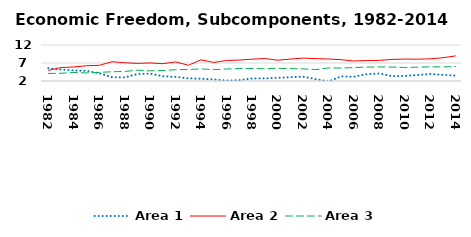
| Category | Area 1 | Area 2 | Area 3 |
|---|---|---|---|
| 1982.0 | 5.53 | 4.941 | 4.092 |
| 1983.0 | 5.189 | 5.735 | 4.14 |
| 1984.0 | 4.924 | 5.889 | 4.375 |
| 1985.0 | 4.811 | 6.241 | 4.236 |
| 1986.0 | 4.141 | 6.353 | 4.383 |
| 1987.0 | 3.063 | 7.36 | 4.567 |
| 1988.0 | 2.995 | 7.066 | 4.651 |
| 1989.0 | 3.935 | 6.888 | 5.02 |
| 1990.0 | 4.038 | 7.011 | 4.812 |
| 1991.0 | 3.326 | 6.808 | 4.91 |
| 1992.0 | 3.127 | 7.301 | 5.132 |
| 1993.0 | 2.737 | 6.378 | 5.208 |
| 1994.0 | 2.633 | 7.883 | 5.348 |
| 1995.0 | 2.434 | 7.153 | 5.16 |
| 1996.0 | 2.128 | 7.692 | 5.332 |
| 1997.0 | 2.235 | 7.812 | 5.48 |
| 1998.0 | 2.713 | 8.061 | 5.484 |
| 1999.0 | 2.718 | 8.249 | 5.4 |
| 2000.0 | 2.904 | 7.772 | 5.517 |
| 2001.0 | 3.055 | 8.091 | 5.439 |
| 2002.0 | 3.207 | 8.371 | 5.365 |
| 2003.0 | 2.534 | 8.218 | 5.173 |
| 2004.0 | 1.862 | 8.102 | 5.621 |
| 2005.0 | 3.286 | 7.928 | 5.606 |
| 2006.0 | 3.167 | 7.55 | 5.731 |
| 2007.0 | 3.886 | 7.687 | 5.849 |
| 2008.0 | 4.089 | 7.723 | 5.919 |
| 2009.0 | 3.336 | 7.995 | 5.862 |
| 2010.0 | 3.415 | 8.089 | 5.758 |
| 2011.0 | 3.656 | 8.054 | 5.841 |
| 2012.0 | 3.946 | 8.155 | 5.95 |
| 2013.0 | 3.711 | 8.461 | 5.907 |
| 2014.0 | 3.491 | 8.973 | 6.01 |